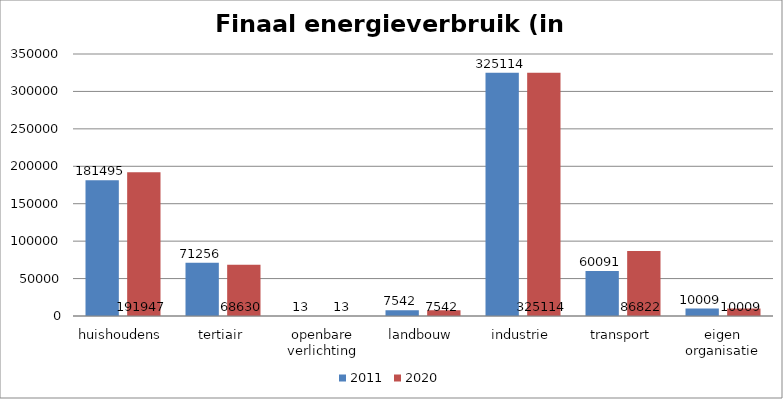
| Category | 2011 | 2020 |
|---|---|---|
| huishoudens | 181494.596 | 191946.615 |
| tertiair | 71256.149 | 68629.932 |
| openbare verlichting | 12.993 | 12.993 |
| landbouw | 7542.166 | 7542.166 |
| industrie | 325114.306 | 325114.306 |
| transport | 60091.301 | 86821.529 |
| eigen organisatie | 10008.762 | 10008.762 |